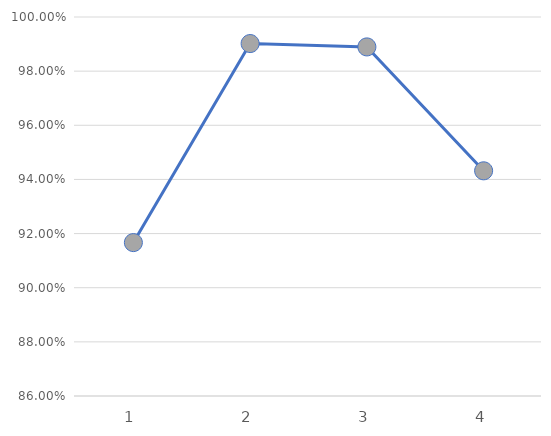
| Category | Series 0 |
|---|---|
| 0 | 0.917 |
| 1 | 0.99 |
| 2 | 0.989 |
| 3 | 0.943 |